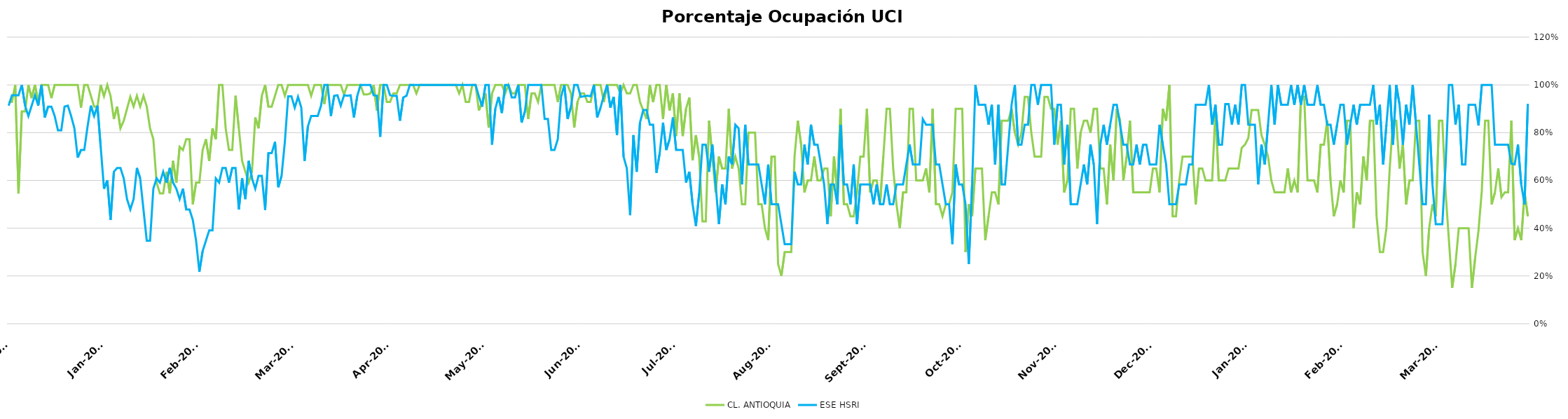
| Category | CL. ANTIOQUIA | ESE HSRI |
|---|---|---|
| 2021-01-01 | 0.929 | 0.913 |
| 2021-01-02 | 0.929 | 0.957 |
| 2021-01-03 | 1 | 0.957 |
| 2021-01-04 | 0.545 | 0.957 |
| 2021-01-05 | 0.889 | 1 |
| 2021-01-06 | 0.889 | 0.913 |
| 2021-01-07 | 1 | 0.87 |
| 2021-01-08 | 0.944 | 0.913 |
| 2021-01-09 | 1 | 0.957 |
| 2021-01-10 | 0.929 | 0.913 |
| 2021-01-11 | 1 | 1 |
| 2021-01-12 | 1 | 0.864 |
| 2021-01-13 | 1 | 0.909 |
| 2021-01-14 | 0.944 | 0.909 |
| 2021-01-15 | 1 | 0.87 |
| 2021-01-16 | 1 | 0.81 |
| 2021-01-17 | 1 | 0.81 |
| 2021-01-18 | 1 | 0.909 |
| 2021-01-19 | 1 | 0.913 |
| 2021-01-20 | 1 | 0.87 |
| 2021-01-21 | 1 | 0.818 |
| 2021-01-22 | 1 | 0.696 |
| 2021-01-23 | 0.905 | 0.727 |
| 2021-01-24 | 1 | 0.727 |
| 2021-01-25 | 1 | 0.826 |
| 2021-01-26 | 0.955 | 0.913 |
| 2021-01-27 | 0.909 | 0.87 |
| 2021-01-28 | 0.909 | 0.913 |
| 2021-01-29 | 1 | 0.739 |
| 2021-01-30 | 0.952 | 0.565 |
| 2021-01-31 | 1 | 0.6 |
| 2021-02-01 | 0.952 | 0.435 |
| 2021-02-02 | 0.857 | 0.636 |
| 2021-02-03 | 0.909 | 0.652 |
| 2021-02-04 | 0.818 | 0.652 |
| 2021-02-05 | 0.85 | 0.609 |
| 2021-02-06 | 0.9 | 0.522 |
| 2021-02-07 | 0.95 | 0.478 |
| 2021-02-08 | 0.909 | 0.522 |
| 2021-02-09 | 0.955 | 0.652 |
| 2021-02-10 | 0.909 | 0.609 |
| 2021-02-11 | 0.955 | 0.478 |
| 2021-02-12 | 0.909 | 0.348 |
| 2021-02-13 | 0.818 | 0.348 |
| 2021-02-14 | 0.773 | 0.565 |
| 2021-02-15 | 0.591 | 0.609 |
| 2021-02-16 | 0.545 | 0.591 |
| 2021-02-17 | 0.545 | 0.636 |
| 2021-02-18 | 0.636 | 0.591 |
| 2021-02-19 | 0.545 | 0.652 |
| 2021-02-20 | 0.682 | 0.591 |
| 2021-02-21 | 0.591 | 0.565 |
| 2021-02-22 | 0.741 | 0.522 |
| 2021-02-23 | 0.727 | 0.565 |
| 2021-02-24 | 0.773 | 0.478 |
| 2021-02-25 | 0.773 | 0.478 |
| 2021-02-26 | 0.5 | 0.435 |
| 2021-02-27 | 0.591 | 0.348 |
| 2021-02-28 | 0.591 | 0.217 |
| 2021-03-01 | 0.727 | 0.304 |
| 2021-03-02 | 0.773 | 0.348 |
| 2021-03-03 | 0.682 | 0.391 |
| 2021-03-04 | 0.818 | 0.391 |
| 2021-03-05 | 0.773 | 0.609 |
| 2021-03-06 | 1 | 0.591 |
| 2021-03-07 | 1 | 0.652 |
| 2021-03-08 | 0.818 | 0.652 |
| 2021-03-09 | 0.727 | 0.591 |
| 2021-03-10 | 0.727 | 0.652 |
| 2021-03-11 | 0.955 | 0.652 |
| 2021-03-12 | 0.818 | 0.478 |
| 2021-03-13 | 0.682 | 0.609 |
| 2021-03-14 | 0.636 | 0.522 |
| 2021-03-15 | 0.591 | 0.682 |
| 2021-03-16 | 0.636 | 0.609 |
| 2021-03-17 | 0.864 | 0.565 |
| 2021-03-18 | 0.818 | 0.619 |
| 2021-03-19 | 0.955 | 0.619 |
| 2021-03-20 | 1 | 0.476 |
| 2021-03-21 | 0.909 | 0.714 |
| 2021-03-22 | 0.909 | 0.714 |
| 2021-03-23 | 0.955 | 0.762 |
| 2021-03-24 | 1 | 0.571 |
| 2021-03-25 | 1 | 0.619 |
| 2021-03-26 | 0.955 | 0.762 |
| 2021-03-27 | 1 | 0.952 |
| 2021-03-28 | 1 | 0.952 |
| 2021-03-29 | 1 | 0.905 |
| 2021-03-30 | 1 | 0.95 |
| 2021-03-31 | 1 | 0.905 |
| 2021-04-01 | 1 | 0.682 |
| 2021-04-02 | 1 | 0.826 |
| 2021-04-03 | 0.955 | 0.87 |
| 2021-04-04 | 1 | 0.87 |
| 2021-04-05 | 1 | 0.87 |
| 2021-04-06 | 1 | 0.913 |
| 2021-04-07 | 0.92 | 1 |
| 2021-04-08 | 1 | 1 |
| 2021-04-09 | 1 | 0.87 |
| 2021-04-10 | 1 | 0.955 |
| 2021-04-11 | 1 | 0.957 |
| 2021-04-12 | 1 | 0.913 |
| 2021-04-13 | 0.96 | 0.957 |
| 2021-04-14 | 1 | 0.955 |
| 2021-04-15 | 1 | 0.957 |
| 2021-04-16 | 1 | 0.864 |
| 2021-04-17 | 1 | 0.952 |
| 2021-04-18 | 1 | 1 |
| 2021-04-19 | 0.96 | 1 |
| 2021-04-20 | 0.96 | 1 |
| 2021-04-21 | 0.964 | 1 |
| 2021-04-22 | 1 | 0.957 |
| 2021-04-23 | 0.893 | 0.955 |
| 2021-04-24 | 1 | 0.783 |
| 2021-04-25 | 1 | 1 |
| 2021-04-26 | 0.929 | 1 |
| 2021-04-27 | 0.929 | 0.957 |
| 2021-04-28 | 0.964 | 0.955 |
| 2021-04-29 | 0.964 | 0.955 |
| 2021-04-30 | 1 | 0.85 |
| 2021-05-01 | 1 | 0.947 |
| 2021-05-02 | 1 | 0.955 |
| 2021-05-03 | 1 | 1 |
| 2021-05-04 | 1 | 1 |
| 2021-05-05 | 0.964 | 1 |
| 2021-05-06 | 1 | 1 |
| 2021-05-07 | 1 | 1 |
| 2021-05-08 | 1 | 1 |
| 2021-05-09 | 1 | 1 |
| 2021-05-10 | 1 | 1 |
| 2021-05-11 | 1 | 1 |
| 2021-05-12 | 1 | 1 |
| 2021-05-13 | 1 | 1 |
| 2021-05-14 | 1 | 1 |
| 2021-05-15 | 1 | 1 |
| 2021-05-16 | 1 | 1 |
| 2021-05-17 | 1 | 1 |
| 2021-05-18 | 0.964 | 1 |
| 2021-05-19 | 1 | 1 |
| 2021-05-20 | 0.929 | 1 |
| 2021-05-21 | 0.929 | 1 |
| 2021-05-22 | 1 | 1 |
| 2021-05-23 | 1 | 1 |
| 2021-05-24 | 0.893 | 0.952 |
| 2021-05-25 | 0.929 | 0.909 |
| 2021-05-26 | 0.964 | 1 |
| 2021-05-27 | 0.821 | 1 |
| 2021-05-28 | 0.964 | 0.75 |
| 2021-05-29 | 1 | 0.9 |
| 2021-05-30 | 1 | 0.95 |
| 2021-05-31 | 1 | 0.882 |
| 2021-06-01 | 0.964 | 1 |
| 2021-06-02 | 1 | 1 |
| 2021-06-03 | 0.964 | 0.947 |
| 2021-06-04 | 0.964 | 0.947 |
| 2021-06-05 | 1 | 1 |
| 2021-06-06 | 1 | 0.842 |
| 2021-06-07 | 1 | 0.889 |
| 2021-06-08 | 0.857 | 1 |
| 2021-06-09 | 0.964 | 1 |
| 2021-06-10 | 0.964 | 1 |
| 2021-06-11 | 0.929 | 1 |
| 2021-06-12 | 1 | 1 |
| 2021-06-13 | 1 | 0.857 |
| 2021-06-14 | 1 | 0.857 |
| 2021-06-15 | 1 | 0.727 |
| 2021-06-16 | 1 | 0.727 |
| 2021-06-17 | 0.929 | 0.773 |
| 2021-06-18 | 1 | 0.95 |
| 2021-06-19 | 1 | 1 |
| 2021-06-20 | 1 | 0.857 |
| 2021-06-21 | 0.964 | 0.909 |
| 2021-06-22 | 0.821 | 1 |
| 2021-06-23 | 0.929 | 1 |
| 2021-06-24 | 0.964 | 0.95 |
| 2021-06-25 | 0.964 | 0.952 |
| 2021-06-26 | 0.929 | 0.955 |
| 2021-06-27 | 0.929 | 0.952 |
| 2021-06-28 | 1 | 1 |
| 2021-06-29 | 1 | 0.864 |
| 2021-06-30 | 1 | 0.905 |
| 2021-07-01 | 0.929 | 0.955 |
| 2021-07-02 | 1 | 1 |
| 2021-07-03 | 1 | 0.905 |
| 2021-07-04 | 1 | 0.95 |
| 2021-07-05 | 1 | 0.789 |
| 2021-07-06 | 0.964 | 1 |
| 2021-07-07 | 1 | 0.7 |
| 2021-07-08 | 0.964 | 0.65 |
| 2021-07-09 | 0.964 | 0.455 |
| 2021-07-10 | 1 | 0.789 |
| 2021-07-11 | 1 | 0.636 |
| 2021-07-12 | 0.929 | 0.842 |
| 2021-07-13 | 0.893 | 0.895 |
| 2021-07-14 | 0.857 | 0.895 |
| 2021-07-15 | 1 | 0.833 |
| 2021-07-16 | 0.929 | 0.833 |
| 2021-07-17 | 1 | 0.632 |
| 2021-07-18 | 1 | 0.714 |
| 2021-07-19 | 0.857 | 0.842 |
| 2021-07-20 | 1 | 0.727 |
| 2021-07-21 | 0.893 | 0.773 |
| 2021-07-22 | 0.964 | 0.864 |
| 2021-07-23 | 0.786 | 0.727 |
| 2021-07-24 | 0.964 | 0.727 |
| 2021-07-25 | 0.786 | 0.727 |
| 2021-07-26 | 0.9 | 0.591 |
| 2021-07-27 | 0.947 | 0.636 |
| 2021-07-28 | 0.684 | 0.5 |
| 2021-07-29 | 0.789 | 0.409 |
| 2021-07-30 | 0.7 | 0.545 |
| 2021-07-31 | 0.429 | 0.75 |
| 2021-08-01 | 0.429 | 0.75 |
| 2021-08-02 | 0.85 | 0.636 |
| 2021-08-03 | 0.7 | 0.75 |
| 2021-08-04 | 0.55 | 0.583 |
| 2021-08-05 | 0.7 | 0.417 |
| 2021-08-06 | 0.65 | 0.583 |
| 2021-08-07 | 0.65 | 0.5 |
| 2021-08-08 | 0.9 | 0.7 |
| 2021-08-09 | 0.65 | 0.667 |
| 2021-08-10 | 0.7 | 0.833 |
| 2021-08-11 | 0.65 | 0.818 |
| 2021-08-12 | 0.5 | 0.583 |
| 2021-08-13 | 0.5 | 0.833 |
| 2021-08-14 | 0.8 | 0.667 |
| 2021-08-15 | 0.8 | 0.667 |
| 2021-08-16 | 0.8 | 0.667 |
| 2021-08-17 | 0.5 | 0.667 |
| 2021-08-18 | 0.5 | 0.583 |
| 2021-08-19 | 0.4 | 0.5 |
| 2021-08-20 | 0.35 | 0.667 |
| 2021-08-21 | 0.7 | 0.5 |
| 2021-08-22 | 0.7 | 0.5 |
| 2021-08-23 | 0.25 | 0.5 |
| 2021-08-24 | 0.2 | 0.417 |
| 2021-08-25 | 0.3 | 0.333 |
| 2021-08-26 | 0.3 | 0.333 |
| 2021-08-27 | 0.3 | 0.333 |
| 2021-08-28 | 0.7 | 0.636 |
| 2021-08-29 | 0.85 | 0.583 |
| 2021-08-30 | 0.75 | 0.583 |
| 2021-08-31 | 0.55 | 0.75 |
| 2021-09-01 | 0.6 | 0.667 |
| 2021-09-02 | 0.6 | 0.833 |
| 2021-09-03 | 0.7 | 0.75 |
| 2021-09-04 | 0.6 | 0.75 |
| 2021-09-05 | 0.6 | 0.667 |
| 2021-09-06 | 0.65 | 0.583 |
| 2021-09-07 | 0.65 | 0.417 |
| 2021-09-08 | 0.45 | 0.583 |
| 2021-09-09 | 0.7 | 0.583 |
| 2021-09-10 | 0.55 | 0.5 |
| 2021-09-11 | 0.9 | 0.833 |
| 2021-09-12 | 0.5 | 0.583 |
| 2021-09-13 | 0.5 | 0.583 |
| 2021-09-14 | 0.45 | 0.5 |
| 2021-09-15 | 0.45 | 0.667 |
| 2021-09-16 | 0.55 | 0.417 |
| 2021-09-17 | 0.7 | 0.583 |
| 2021-09-18 | 0.7 | 0.583 |
| 2021-09-19 | 0.9 | 0.583 |
| 2021-09-20 | 0.55 | 0.583 |
| 2021-09-21 | 0.6 | 0.5 |
| 2021-09-22 | 0.6 | 0.583 |
| 2021-09-23 | 0.5 | 0.5 |
| 2021-09-24 | 0.7 | 0.5 |
| 2021-09-25 | 0.9 | 0.583 |
| 2021-09-26 | 0.9 | 0.5 |
| 2021-09-27 | 0.65 | 0.5 |
| 2021-09-28 | 0.5 | 0.583 |
| 2021-09-29 | 0.4 | 0.583 |
| 2021-09-30 | 0.55 | 0.583 |
| 2021-10-01 | 0.55 | 0.667 |
| 2021-10-02 | 0.9 | 0.75 |
| 2021-10-03 | 0.9 | 0.667 |
| 2021-10-04 | 0.6 | 0.667 |
| 2021-10-05 | 0.6 | 0.667 |
| 2021-10-06 | 0.6 | 0.857 |
| 2021-10-07 | 0.65 | 0.833 |
| 2021-10-08 | 0.55 | 0.833 |
| 2021-10-09 | 0.9 | 0.833 |
| 2021-10-10 | 0.5 | 0.667 |
| 2021-10-11 | 0.5 | 0.667 |
| 2021-10-12 | 0.45 | 0.583 |
| 2021-10-13 | 0.5 | 0.5 |
| 2021-10-14 | 0.5 | 0.5 |
| 2021-10-15 | 0.55 | 0.333 |
| 2021-10-16 | 0.9 | 0.667 |
| 2021-10-17 | 0.9 | 0.583 |
| 2021-10-18 | 0.9 | 0.583 |
| 2021-10-19 | 0.3 | 0.5 |
| 2021-10-20 | 0.5 | 0.25 |
| 2021-10-21 | 0.45 | 0.583 |
| 2021-10-22 | 0.65 | 1 |
| 2021-10-23 | 0.65 | 0.917 |
| 2021-10-24 | 0.65 | 0.917 |
| 2021-10-25 | 0.35 | 0.917 |
| 2021-10-26 | 0.45 | 0.833 |
| 2021-10-27 | 0.55 | 0.917 |
| 2021-10-28 | 0.55 | 0.667 |
| 2021-10-29 | 0.5 | 0.917 |
| 2021-10-30 | 0.85 | 0.583 |
| 2021-10-31 | 0.85 | 0.583 |
| 2021-11-01 | 0.85 | 0.75 |
| 2021-11-02 | 0.9 | 0.917 |
| 2021-11-03 | 0.8 | 1 |
| 2021-11-04 | 0.75 | 0.75 |
| 2021-11-05 | 0.8 | 0.75 |
| 2021-11-06 | 0.95 | 0.833 |
| 2021-11-07 | 0.95 | 0.833 |
| 2021-11-08 | 0.8 | 1 |
| 2021-11-09 | 0.7 | 1 |
| 2021-11-10 | 0.7 | 0.917 |
| 2021-11-11 | 0.7 | 1 |
| 2021-11-12 | 0.95 | 1 |
| 2021-11-13 | 0.95 | 1 |
| 2021-11-14 | 0.9 | 1 |
| 2021-11-15 | 0.9 | 0.75 |
| 2021-11-16 | 0.75 | 0.917 |
| 2021-11-17 | 0.85 | 0.917 |
| 2021-11-18 | 0.55 | 0.667 |
| 2021-11-19 | 0.6 | 0.833 |
| 2021-11-20 | 0.9 | 0.5 |
| 2021-11-21 | 0.9 | 0.5 |
| 2021-11-22 | 0.65 | 0.5 |
| 2021-11-23 | 0.8 | 0.583 |
| 2021-11-24 | 0.85 | 0.667 |
| 2021-11-25 | 0.85 | 0.583 |
| 2021-11-26 | 0.8 | 0.75 |
| 2021-11-27 | 0.9 | 0.667 |
| 2021-11-28 | 0.9 | 0.417 |
| 2021-11-29 | 0.65 | 0.75 |
| 2021-11-30 | 0.65 | 0.833 |
| 2021-12-01 | 0.5 | 0.75 |
| 2021-12-02 | 0.75 | 0.833 |
| 2021-12-03 | 0.6 | 0.917 |
| 2021-12-04 | 0.9 | 0.917 |
| 2021-12-05 | 0.85 | 0.833 |
| 2021-12-06 | 0.6 | 0.75 |
| 2021-12-07 | 0.7 | 0.75 |
| 2021-12-08 | 0.85 | 0.667 |
| 2021-12-09 | 0.55 | 0.667 |
| 2021-12-10 | 0.55 | 0.75 |
| 2021-12-11 | 0.55 | 0.667 |
| 2021-12-12 | 0.55 | 0.75 |
| 2021-12-13 | 0.55 | 0.75 |
| 2021-12-14 | 0.55 | 0.667 |
| 2021-12-15 | 0.65 | 0.667 |
| 2021-12-16 | 0.65 | 0.667 |
| 2021-12-17 | 0.55 | 0.833 |
| 2021-12-18 | 0.9 | 0.75 |
| 2021-12-19 | 0.85 | 0.667 |
| 2021-12-20 | 1 | 0.5 |
| 2021-12-21 | 0.45 | 0.5 |
| 2021-12-22 | 0.45 | 0.5 |
| 2021-12-23 | 0.6 | 0.583 |
| 2021-12-24 | 0.7 | 0.583 |
| 2021-12-25 | 0.7 | 0.583 |
| 2021-12-26 | 0.7 | 0.667 |
| 2021-12-27 | 0.7 | 0.667 |
| 2021-12-28 | 0.5 | 0.917 |
| 2021-12-29 | 0.65 | 0.917 |
| 2021-12-30 | 0.65 | 0.917 |
| 2021-12-31 | 0.6 | 0.917 |
| 2022-01-01 | 0.6 | 1 |
| 2022-01-02 | 0.6 | 0.833 |
| 2022-01-03 | 0.89 | 0.917 |
| 2022-01-04 | 0.6 | 0.75 |
| 2022-01-05 | 0.6 | 0.75 |
| 2022-01-06 | 0.6 | 0.92 |
| 2022-01-07 | 0.65 | 0.92 |
| 2022-01-08 | 0.65 | 0.833 |
| 2022-01-09 | 0.65 | 0.917 |
| 2022-01-10 | 0.65 | 0.833 |
| 2022-01-11 | 0.737 | 1 |
| 2022-01-12 | 0.75 | 1 |
| 2022-01-13 | 0.778 | 0.833 |
| 2022-01-14 | 0.895 | 0.833 |
| 2022-01-15 | 0.895 | 0.833 |
| 2022-01-16 | 0.895 | 0.583 |
| 2022-01-17 | 0.789 | 0.75 |
| 2022-01-18 | 0.75 | 0.667 |
| 2022-01-19 | 0.7 | 0.833 |
| 2022-01-20 | 0.6 | 1 |
| 2022-01-21 | 0.55 | 0.833 |
| 2022-01-22 | 0.55 | 1 |
| 2022-01-23 | 0.55 | 0.917 |
| 2022-01-24 | 0.55 | 0.917 |
| 2022-01-25 | 0.65 | 0.917 |
| 2022-01-26 | 0.55 | 1 |
| 2022-01-27 | 0.6 | 0.917 |
| 2022-01-28 | 0.55 | 1 |
| 2022-01-29 | 0.95 | 0.917 |
| 2022-01-30 | 0.95 | 1 |
| 2022-01-31 | 0.6 | 0.917 |
| 2022-02-01 | 0.6 | 0.917 |
| 2022-02-02 | 0.6 | 0.917 |
| 2022-02-03 | 0.55 | 1 |
| 2022-02-04 | 0.75 | 0.917 |
| 2022-02-05 | 0.75 | 0.917 |
| 2022-02-06 | 0.85 | 0.833 |
| 2022-02-07 | 0.6 | 0.833 |
| 2022-02-08 | 0.45 | 0.75 |
| 2022-02-09 | 0.5 | 0.833 |
| 2022-02-10 | 0.6 | 0.917 |
| 2022-02-11 | 0.55 | 0.917 |
| 2022-02-12 | 0.85 | 0.75 |
| 2022-02-13 | 0.85 | 0.833 |
| 2022-02-14 | 0.4 | 0.917 |
| 2022-02-15 | 0.55 | 0.833 |
| 2022-02-16 | 0.5 | 0.917 |
| 2022-02-17 | 0.7 | 0.917 |
| 2022-02-18 | 0.6 | 0.917 |
| 2022-02-19 | 0.85 | 0.917 |
| 2022-02-20 | 0.85 | 1 |
| 2022-02-21 | 0.45 | 0.833 |
| 2022-02-22 | 0.3 | 0.917 |
| 2022-02-23 | 0.3 | 0.667 |
| 2022-02-24 | 0.4 | 0.833 |
| 2022-02-25 | 0.65 | 1 |
| 2022-02-26 | 0.85 | 0.75 |
| 2022-02-27 | 0.85 | 1 |
| 2022-02-28 | 0.65 | 0.917 |
| 2022-03-01 | 0.75 | 0.75 |
| 2022-03-02 | 0.5 | 0.917 |
| 2022-03-03 | 0.6 | 0.833 |
| 2022-03-04 | 0.6 | 1 |
| 2022-03-05 | 0.85 | 0.833 |
| 2022-03-06 | 0.85 | 0.667 |
| 2022-03-07 | 0.3 | 0.5 |
| 2022-03-08 | 0.2 | 0.5 |
| 2022-03-09 | 0.4 | 0.875 |
| 2022-03-10 | 0.5 | 0.583 |
| 2022-03-11 | 0.45 | 0.417 |
| 2022-03-12 | 0.85 | 0.417 |
| 2022-03-13 | 0.85 | 0.417 |
| 2022-03-14 | 0.55 | 0.667 |
| 2022-03-15 | 0.35 | 1 |
| 2022-03-16 | 0.15 | 1 |
| 2022-03-17 | 0.25 | 0.833 |
| 2022-03-18 | 0.4 | 0.917 |
| 2022-03-19 | 0.4 | 0.667 |
| 2022-03-20 | 0.4 | 0.667 |
| 2022-03-21 | 0.4 | 0.917 |
| 2022-03-22 | 0.15 | 0.917 |
| 2022-03-23 | 0.278 | 0.917 |
| 2022-03-24 | 0.39 | 0.83 |
| 2022-03-25 | 0.556 | 1 |
| 2022-03-26 | 0.85 | 1 |
| 2022-03-27 | 0.85 | 1 |
| 2022-03-28 | 0.5 | 1 |
| 2022-03-29 | 0.55 | 0.75 |
| 2022-03-30 | 0.65 | 0.75 |
| 2022-03-31 | 0.53 | 0.75 |
| 2022-04-01 | 0.55 | 0.75 |
| 2022-04-02 | 0.55 | 0.75 |
| 2022-04-03 | 0.85 | 0.67 |
| 2022-04-04 | 0.35 | 0.667 |
| 2022-04-05 | 0.4 | 0.75 |
| 2022-04-06 | 0.35 | 0.583 |
| 2022-04-07 | 0.55 | 0.5 |
| 2022-04-08 | 0.45 | 0.92 |